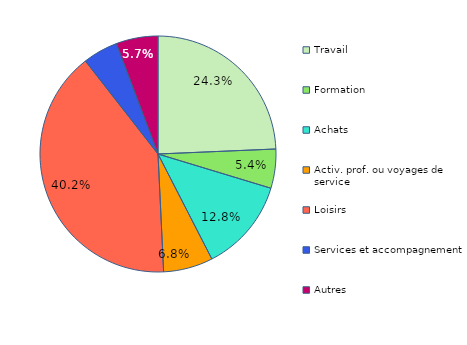
| Category | Series 0 |
|---|---|
| Travail | 24.324 |
| Formation | 5.362 |
| Achats | 12.769 |
| Activ. prof. ou voyages de service | 6.785 |
| Loisirs | 40.213 |
| Services et accompagnement | 4.81 |
| Autres | 5.738 |